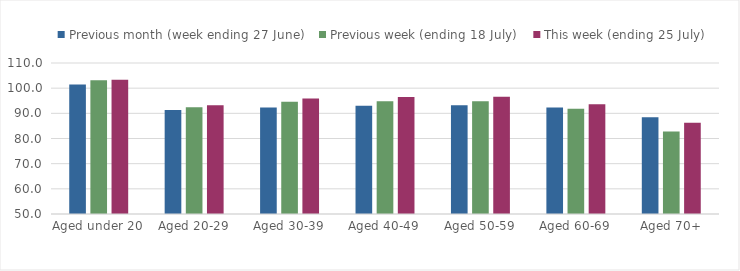
| Category | Previous month (week ending 27 June) | Previous week (ending 18 July) | This week (ending 25 July) |
|---|---|---|---|
| Aged under 20 | 101.457 | 103.113 | 103.392 |
| Aged 20-29 | 91.346 | 92.435 | 93.186 |
| Aged 30-39 | 92.362 | 94.632 | 95.916 |
| Aged 40-49 | 93.021 | 94.831 | 96.494 |
| Aged 50-59 | 93.196 | 94.799 | 96.541 |
| Aged 60-69 | 92.278 | 91.782 | 93.658 |
| Aged 70+ | 88.448 | 82.777 | 86.258 |